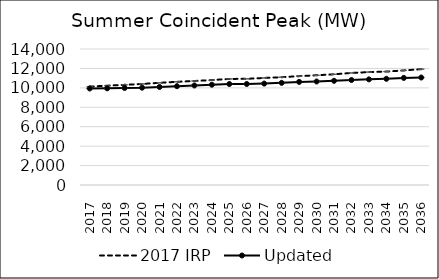
| Category | 2017 IRP | Updated |
|---|---|---|
| 2017.0 | 10129.885 | 9934.753 |
| 2018.0 | 10224.713 | 9952.097 |
| 2019.0 | 10310.015 | 9985.643 |
| 2020.0 | 10403.218 | 10018.034 |
| 2021.0 | 10518.418 | 10090.171 |
| 2022.0 | 10624.16 | 10170.928 |
| 2023.0 | 10706.388 | 10246.21 |
| 2024.0 | 10804.439 | 10322.473 |
| 2025.0 | 10919.631 | 10397.748 |
| 2026.0 | 10931.281 | 10399.686 |
| 2027.0 | 11020.808 | 10440.588 |
| 2028.0 | 11096.123 | 10514.296 |
| 2029.0 | 11207.37 | 10612.889 |
| 2030.0 | 11295.158 | 10655.219 |
| 2031.0 | 11397.05 | 10723.956 |
| 2032.0 | 11535.765 | 10807.879 |
| 2033.0 | 11621.797 | 10874.151 |
| 2034.0 | 11676.522 | 10932.047 |
| 2035.0 | 11793.029 | 11023.221 |
| 2036.0 | 11924.57 | 11064.015 |